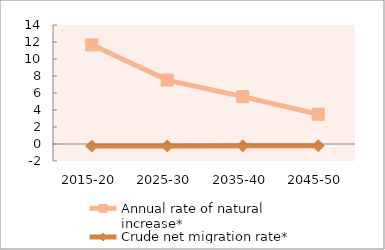
| Category | Annual rate of natural increase* | Crude net migration rate* |
|---|---|---|
| 2015-20 | 11.666 | -0.244 |
| 2025-30 | 7.518 | -0.223 |
| 2035-40 | 5.578 | -0.209 |
| 2045-50 | 3.506 | -0.2 |